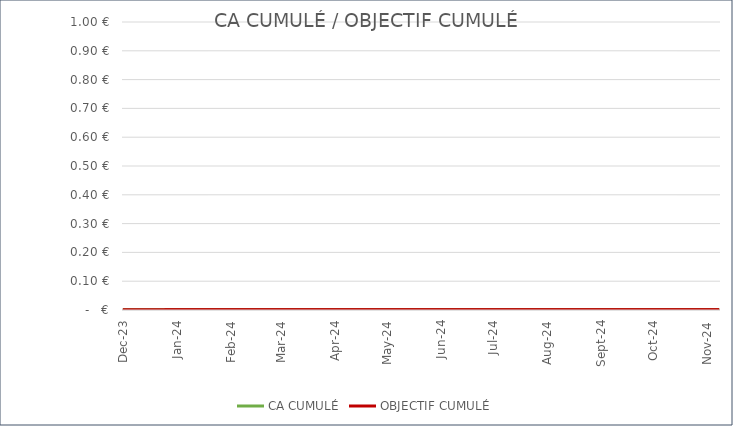
| Category | CA CUMULÉ | OBJECTIF CUMULÉ |
|---|---|---|
| Jan-24 | 4750 | 5170 |
| Feb-24 | 11150 | 10340 |
| Mar-24 | 15000 | 15510 |
| Apr-24 | 24900 | 20680 |
| May-24 | 31245 | 25850 |
| Jun-24 | 44857.5 | 31020 |
| Jul-24 | 51457.5 | 36190 |
| Aug-24 | 56925 | 41360 |
| Sep-24 | 59925 | 46530 |
| Oct-24 | 62325 | 51700 |
| Nov-24 | 64825 | 56870 |
| Dec-23 | 64825 | 62040 |